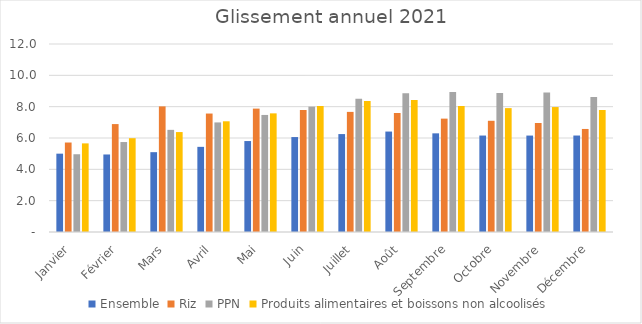
| Category |  Ensemble  |  Riz  |  PPN  |  Produits alimentaires et boissons non alcoolisés  |
|---|---|---|---|---|
| Janvier | 5 | 5.712 | 4.963 | 5.657 |
| Février | 4.948 | 6.888 | 5.742 | 5.988 |
| Mars | 5.096 | 8.018 | 6.52 | 6.379 |
| Avril | 5.435 | 7.561 | 6.994 | 7.067 |
| Mai | 5.806 | 7.876 | 7.471 | 7.573 |
| Juin | 6.06 | 7.789 | 8.002 | 8.041 |
| Juillet | 6.251 | 7.667 | 8.499 | 8.356 |
| Août | 6.411 | 7.597 | 8.863 | 8.428 |
| Septembre | 6.297 | 7.236 | 8.939 | 8.042 |
| Octobre | 6.157 | 7.099 | 8.878 | 7.907 |
| Novembre | 6.155 | 6.957 | 8.904 | 7.975 |
| Décembre | 6.158 | 6.577 | 8.617 | 7.788 |